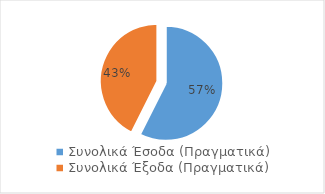
| Category | Series 0 |
|---|---|
| Συνολικά Έσοδα (Πραγματικά) | 1900 |
| Συνολικά Έξοδα (Πραγματικά) | 1409 |